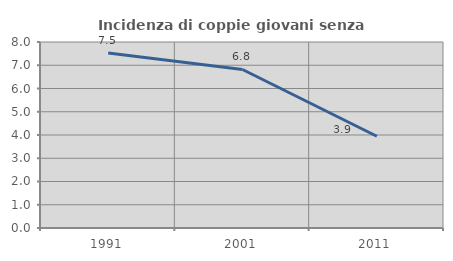
| Category | Incidenza di coppie giovani senza figli |
|---|---|
| 1991.0 | 7.527 |
| 2001.0 | 6.818 |
| 2011.0 | 3.947 |